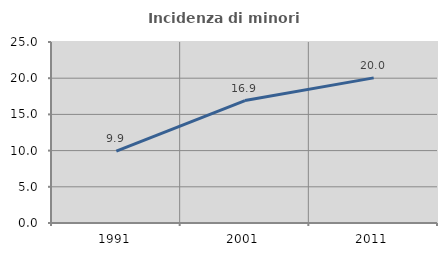
| Category | Incidenza di minori stranieri |
|---|---|
| 1991.0 | 9.93 |
| 2001.0 | 16.916 |
| 2011.0 | 20.046 |